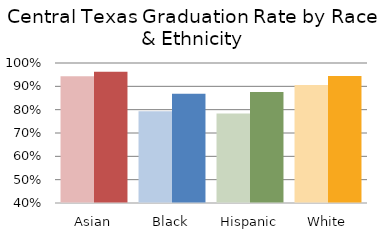
| Category | Class of 2011 | Class of 2020 |
|---|---|---|
| Asian | 0.943 | 0.963 |
| Black | 0.793 | 0.868 |
| Hispanic | 0.784 | 0.876 |
| White | 0.906 | 0.944 |